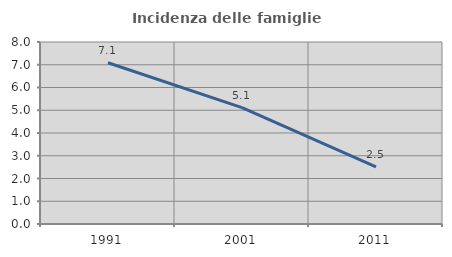
| Category | Incidenza delle famiglie numerose |
|---|---|
| 1991.0 | 7.088 |
| 2001.0 | 5.116 |
| 2011.0 | 2.506 |